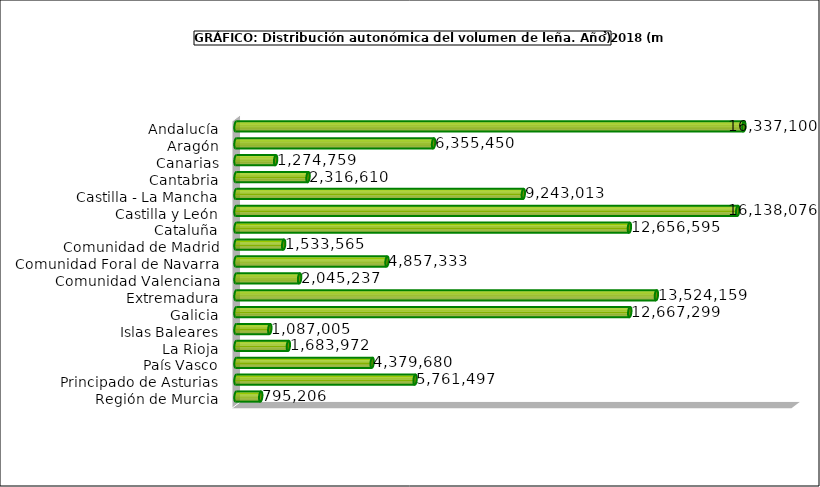
| Category | Series 0 |
|---|---|
| Andalucía | 16337100 |
| Aragón | 6355450 |
| Canarias | 1274758.781 |
| Cantabria | 2316610 |
| Castilla - La Mancha | 9243013 |
| Castilla y León | 16138076 |
| Cataluña | 12656594.555 |
| Comunidad de Madrid | 1533565 |
| Comunidad Foral de Navarra | 4857333 |
| Comunidad Valenciana | 2045237 |
| Extremadura | 13524159.005 |
| Galicia | 12667299 |
| Islas Baleares | 1087005 |
| La Rioja | 1683972 |
| País Vasco | 4379680 |
| Principado de Asturias | 5761497 |
| Región de Murcia | 795206 |